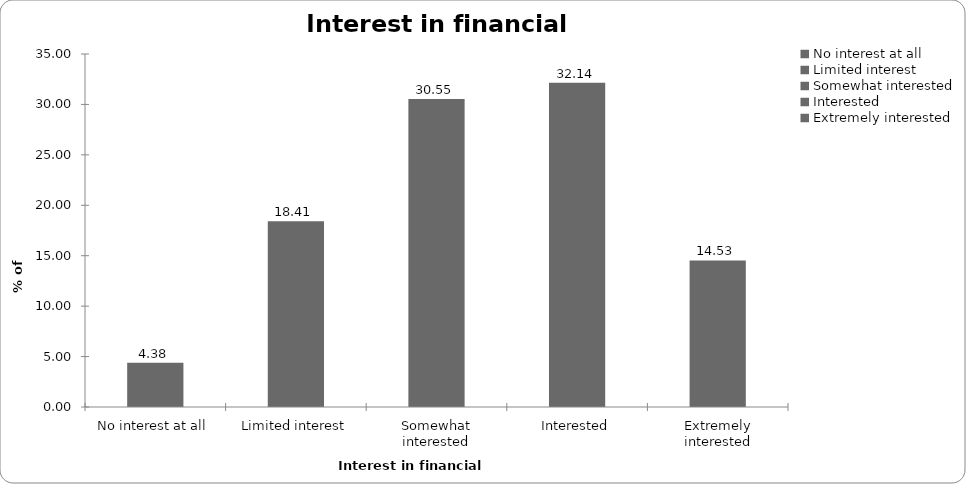
| Category | Interest in financial planning |
|---|---|
| No interest at all | 4.378 |
| Limited interest | 18.408 |
| Somewhat interested | 30.547 |
| Interested | 32.139 |
| Extremely interested | 14.527 |